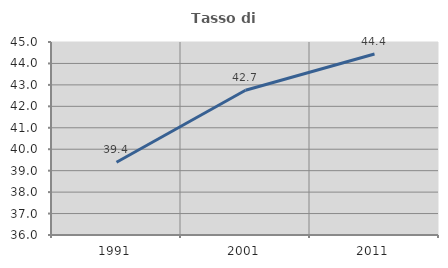
| Category | Tasso di occupazione   |
|---|---|
| 1991.0 | 39.392 |
| 2001.0 | 42.749 |
| 2011.0 | 44.439 |